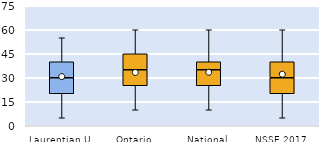
| Category | 25th | 50th | 75th |
|---|---|---|---|
| Laurentian U | 20 | 10 | 10 |
| Ontario | 25 | 10 | 10 |
| National | 25 | 10 | 5 |
| NSSE 2017 | 20 | 10 | 10 |